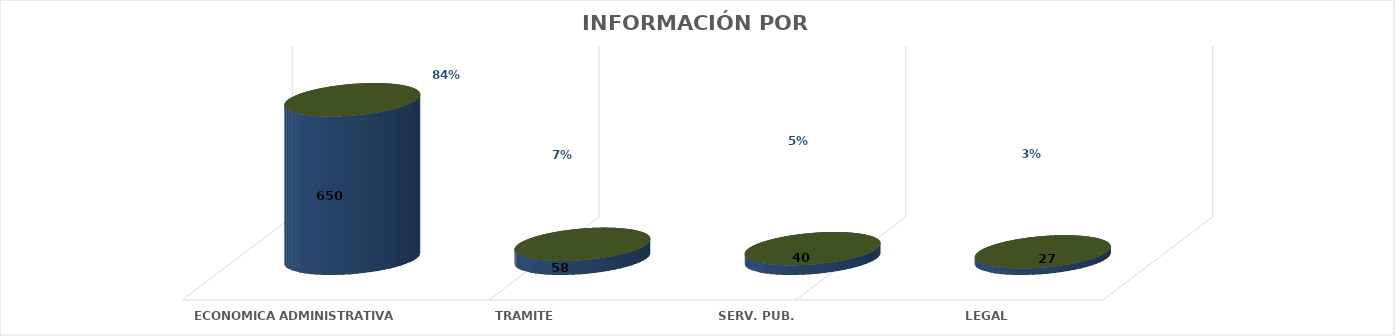
| Category | Series 0 | Series 1 | Series 2 | Series 3 | Series 4 |
|---|---|---|---|---|---|
| ECONOMICA ADMINISTRATIVA |  |  |  | 650 | 0.839 |
| TRAMITE |  |  |  | 58 | 0.075 |
| SERV. PUB. |  |  |  | 40 | 0.052 |
| LEGAL |  |  |  | 27 | 0.035 |